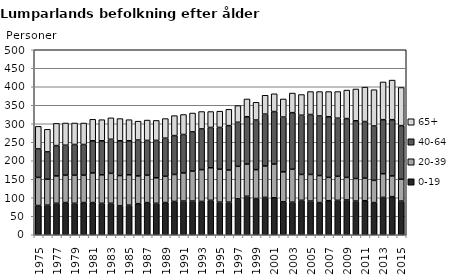
| Category | 0-19 | 20-39 | 40-64 | 65+ |
|---|---|---|---|---|
| 1975.0 | 79 | 76 | 77 | 61 |
| 1976.0 | 80 | 70 | 74 | 61 |
| 1977.0 | 85 | 74 | 82 | 60 |
| 1978.0 | 87 | 74 | 81 | 60 |
| 1979.0 | 85 | 76 | 83 | 58 |
| 1980.0 | 87 | 74 | 83 | 58 |
| 1981.0 | 87 | 80 | 87 | 58 |
| 1982.0 | 85 | 77 | 92 | 57 |
| 1983.0 | 85 | 81 | 92 | 58 |
| 1984.0 | 78 | 82 | 94 | 60 |
| 1985.0 | 80 | 82 | 92 | 57 |
| 1986.0 | 84 | 75 | 97 | 51 |
| 1987.0 | 87 | 74 | 94 | 55 |
| 1988.0 | 85 | 69 | 101 | 54 |
| 1989.0 | 87 | 71 | 103 | 53 |
| 1990.0 | 90 | 73 | 105 | 54 |
| 1991.0 | 91 | 76 | 104 | 54 |
| 1992.0 | 91 | 81 | 106 | 51 |
| 1993.0 | 90 | 86 | 110 | 47 |
| 1994.0 | 93 | 88 | 109 | 43 |
| 1995.0 | 88 | 89 | 113 | 44 |
| 1996.0 | 88 | 87 | 120 | 44 |
| 1997.0 | 97 | 88 | 119 | 45 |
| 1998.0 | 104 | 87 | 128 | 48 |
| 1999.0 | 98 | 78 | 134 | 48 |
| 2000.0 | 101 | 85 | 140 | 51 |
| 2001.0 | 100 | 91 | 142 | 48 |
| 2002.0 | 89 | 81 | 148 | 49 |
| 2003.0 | 88 | 89 | 153 | 53 |
| 2004.0 | 93 | 70 | 160 | 56 |
| 2005.0 | 91 | 72 | 162 | 62 |
| 2006.0 | 87 | 73 | 161 | 66 |
| 2007.0 | 92 | 63 | 164 | 68 |
| 2008.0 | 93 | 65 | 157 | 72 |
| 2009.0 | 94 | 61 | 159 | 77 |
| 2010.0 | 91 | 61 | 156 | 86 |
| 2011.0 | 92 | 61 | 153 | 93 |
| 2012.0 | 87 | 60 | 147 | 98 |
| 2013.0 | 101 | 64 | 146 | 102 |
| 2014.0 | 103 | 56 | 152 | 107 |
| 2015.0 | 91 | 59 | 145 | 103 |